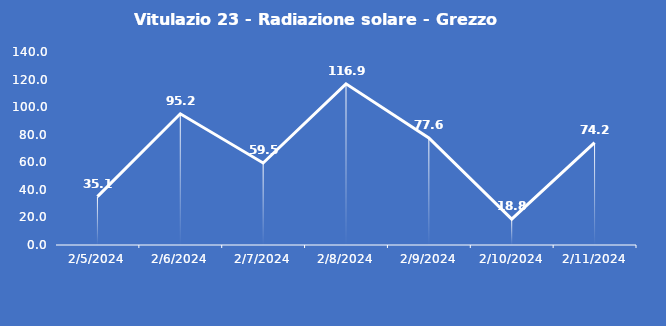
| Category | Vitulazio 23 - Radiazione solare - Grezzo (W/m2) |
|---|---|
| 2/5/24 | 35.1 |
| 2/6/24 | 95.2 |
| 2/7/24 | 59.5 |
| 2/8/24 | 116.9 |
| 2/9/24 | 77.6 |
| 2/10/24 | 18.8 |
| 2/11/24 | 74.2 |